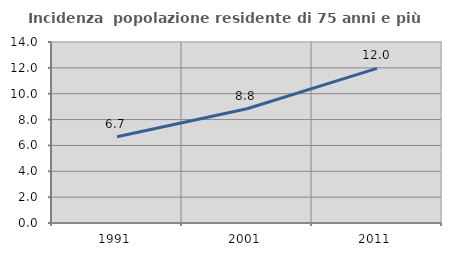
| Category | Incidenza  popolazione residente di 75 anni e più |
|---|---|
| 1991.0 | 6.671 |
| 2001.0 | 8.837 |
| 2011.0 | 11.96 |